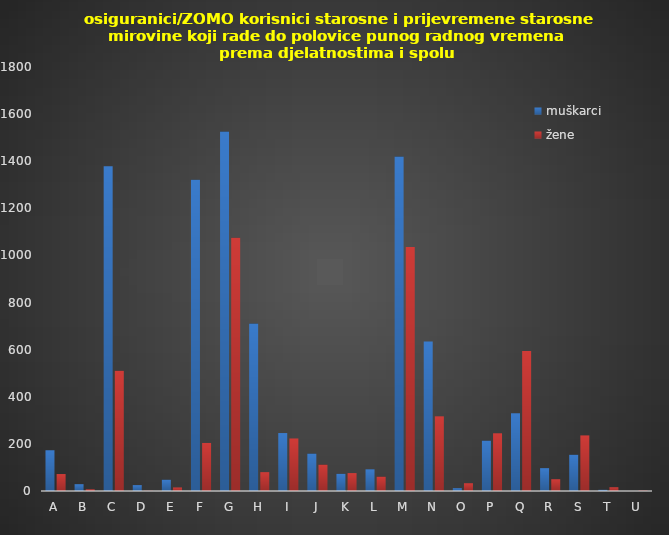
| Category | muškarci | žene |
|---|---|---|
| A | 173 | 72 |
| B | 29 | 7 |
| C | 1379 | 510 |
| D | 25 | 1 |
| E | 48 | 15 |
| F | 1321 | 204 |
| G | 1526 | 1075 |
| H | 711 | 80 |
| I | 246 | 223 |
| J | 159 | 112 |
| K | 73 | 76 |
| L | 92 | 61 |
| M | 1420 | 1036 |
| N | 635 | 317 |
| O | 12 | 33 |
| P | 214 | 245 |
| Q | 330 | 594 |
| R | 97 | 50 |
| S | 154 | 236 |
| T | 5 | 16 |
| U | 0 | 2 |